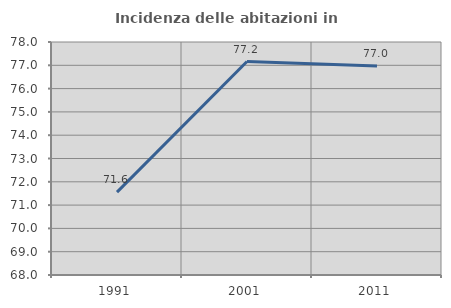
| Category | Incidenza delle abitazioni in proprietà  |
|---|---|
| 1991.0 | 71.557 |
| 2001.0 | 77.161 |
| 2011.0 | 76.974 |